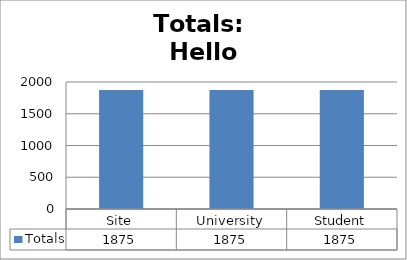
| Category | Totals |
|---|---|
| Site | 1875 |
| University | 1875 |
| Student | 1875 |